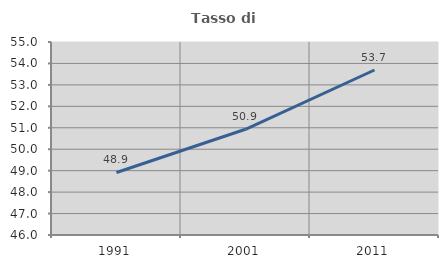
| Category | Tasso di occupazione   |
|---|---|
| 1991.0 | 48.916 |
| 2001.0 | 50.929 |
| 2011.0 | 53.694 |